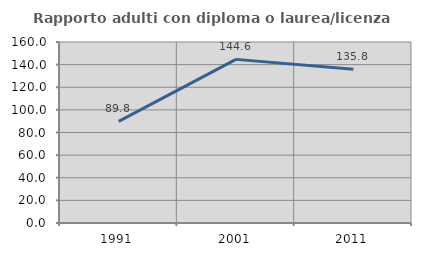
| Category | Rapporto adulti con diploma o laurea/licenza media  |
|---|---|
| 1991.0 | 89.776 |
| 2001.0 | 144.638 |
| 2011.0 | 135.811 |